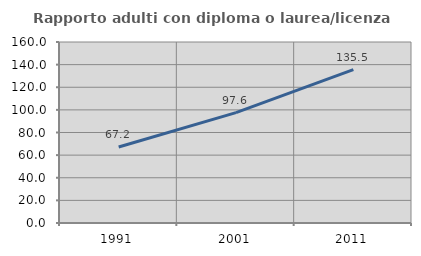
| Category | Rapporto adulti con diploma o laurea/licenza media  |
|---|---|
| 1991.0 | 67.218 |
| 2001.0 | 97.59 |
| 2011.0 | 135.54 |